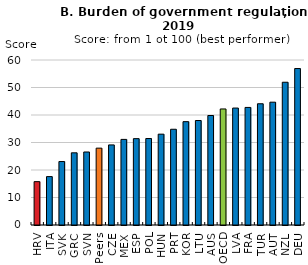
| Category | Burden of government relation |
|---|---|
| HRV | 15.765 |
| ITA | 17.599 |
| SVK | 23.078 |
| GRC | 26.249 |
| SVN | 26.546 |
| Peers | 27.943 |
| CZE | 29.117 |
| MEX | 31.129 |
| ESP | 31.399 |
| POL | 31.446 |
| HUN | 33.033 |
| PRT | 34.815 |
| KOR | 37.575 |
| LTU | 37.998 |
| AUS | 39.818 |
| OECD | 42.197 |
| LVA | 42.527 |
| FRA | 42.753 |
| TUR | 44.089 |
| AUT | 44.661 |
| NZL | 51.912 |
| DEU | 56.896 |